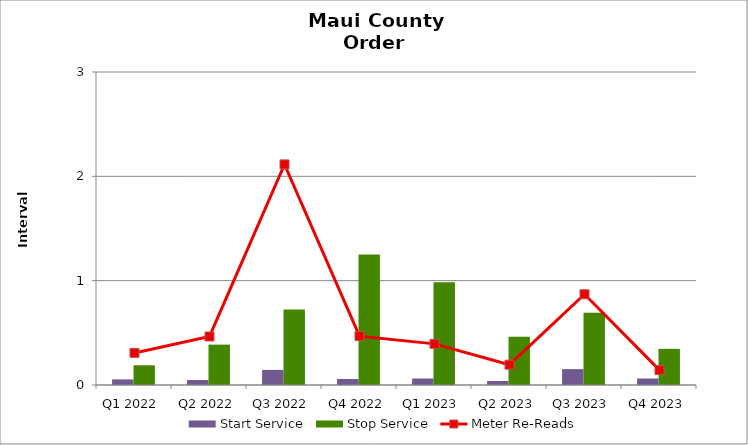
| Category | Start Service | Stop Service |
|---|---|---|
| Q1 2022 | 0.053 | 0.189 |
| Q2 2022 | 0.048 | 0.387 |
| Q3 2022 | 0.145 | 0.724 |
| Q4 2022 | 0.057 | 1.251 |
| Q1 2023 | 0.062 | 0.985 |
| Q2 2023 | 0.038 | 0.462 |
| Q3 2023 | 0.152 | 0.693 |
| Q4 2023 | 0.062 | 0.347 |